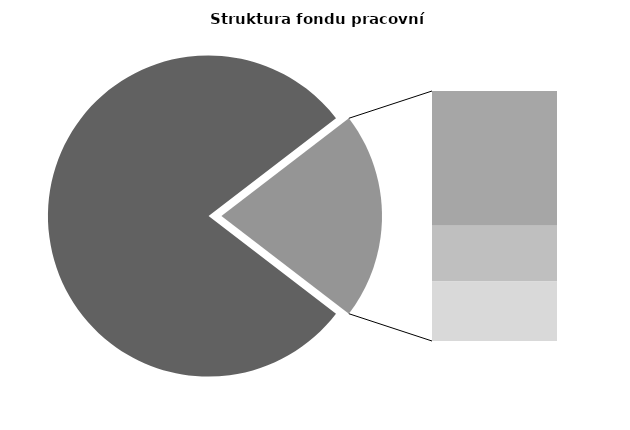
| Category | Series 0 |
|---|---|
| Průměrná měsíční odpracovaná doba bez přesčasu | 136.052 |
| Dovolená | 19.294 |
| Nemoc | 7.976 |
| Jiné | 8.515 |